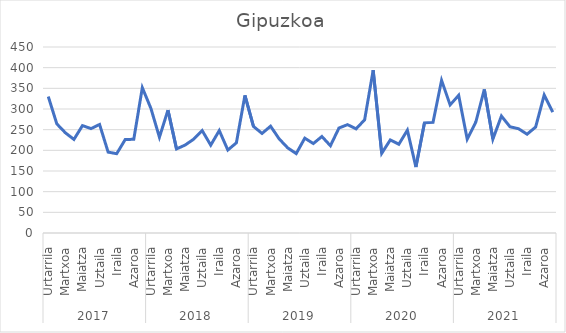
| Category | Gipuzkoa |
|---|---|
| 0 | 330.143 |
| 1 | 264 |
| 2 | 242.429 |
| 3 | 226.429 |
| 4 | 259.857 |
| 5 | 252.571 |
| 6 | 262.571 |
| 7 | 195.714 |
| 8 | 191.857 |
| 9 | 226.143 |
| 10 | 226.714 |
| 11 | 351.571 |
| 12 | 301.714 |
| 13 | 231.714 |
| 14 | 297.286 |
| 15 | 203.429 |
| 16 | 212.714 |
| 17 | 226.857 |
| 18 | 247.857 |
| 19 | 212.571 |
| 20 | 247.857 |
| 21 | 200.714 |
| 22 | 218.143 |
| 23 | 333 |
| 24 | 257.857 |
| 25 | 240.857 |
| 26 | 258.429 |
| 27 | 227.857 |
| 28 | 206 |
| 29 | 192.143 |
| 30 | 229.429 |
| 31 | 216.429 |
| 32 | 233.429 |
| 33 | 211.143 |
| 34 | 254 |
| 35 | 262.143 |
| 36 | 252 |
| 37 | 273.857 |
| 38 | 393.857 |
| 39 | 192.571 |
| 40 | 225.143 |
| 41 | 214.857 |
| 42 | 248.857 |
| 43 | 159.571 |
| 44 | 266.571 |
| 45 | 267.571 |
| 46 | 369.429 |
| 47 | 309.857 |
| 48 | 333 |
| 49 | 227 |
| 50 | 267.857 |
| 51 | 347.289 |
| 52 | 227.143 |
| 53 | 283 |
| 54 | 257 |
| 55 | 252.286 |
| 56 | 239 |
| 57 | 256.286 |
| 58 | 333.718 |
| 59 | 292.429 |